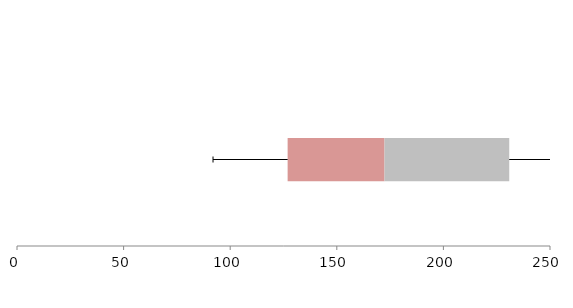
| Category | Series 1 | Series 2 | Series 3 |
|---|---|---|---|
| 0 | 126.938 | 45.445 | 58.504 |